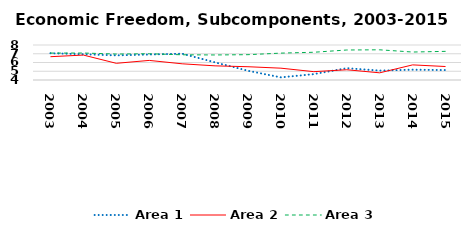
| Category | Area 1 | Area 2 | Area 3 |
|---|---|---|---|
| 2003.0 | 7.059 | 6.664 | 7.077 |
| 2004.0 | 6.944 | 6.848 | 7.083 |
| 2005.0 | 6.816 | 5.907 | 6.966 |
| 2006.0 | 6.913 | 6.238 | 6.999 |
| 2007.0 | 7.007 | 5.851 | 6.882 |
| 2008.0 | 6.013 | 5.617 | 6.861 |
| 2009.0 | 5.055 | 5.516 | 6.894 |
| 2010.0 | 4.299 | 5.35 | 7.072 |
| 2011.0 | 4.672 | 4.952 | 7.171 |
| 2012.0 | 5.349 | 5.17 | 7.429 |
| 2013.0 | 5.074 | 4.821 | 7.452 |
| 2014.0 | 5.18 | 5.728 | 7.196 |
| 2015.0 | 5.136 | 5.54 | 7.274 |